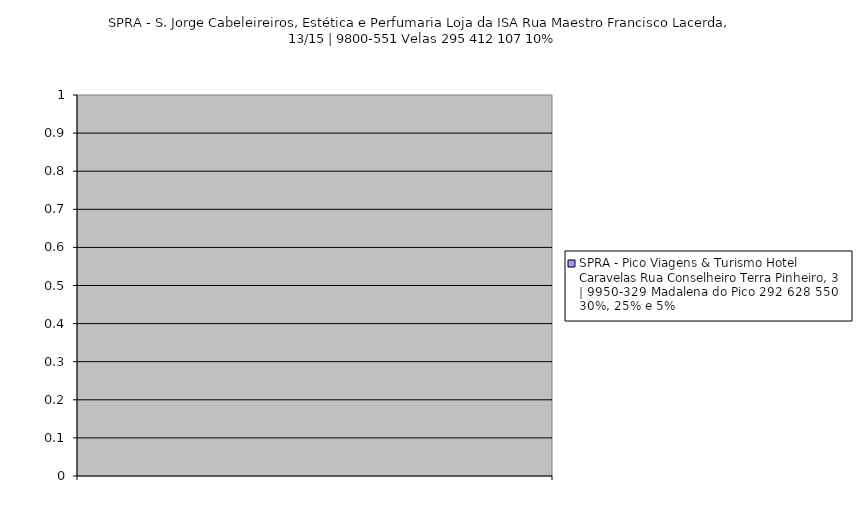
| Category | SPRA - Pico Viagens & Turismo Hotel Caravelas Rua Conselheiro Terra Pinheiro, 3 | 9950-329 Madalena do Pico 292 628 550 30%, 25% e 5% |
|---|---|
|  | 0 |